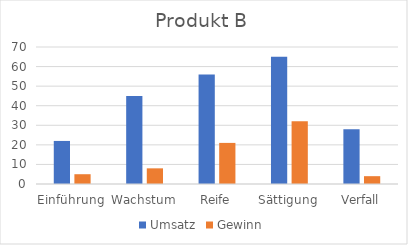
| Category | Umsatz | Gewinn |
|---|---|---|
| Einführung | 22 | 5 |
| Wachstum | 45 | 8 |
| Reife | 56 | 21 |
| Sättigung | 65 | 32 |
| Verfall | 28 | 4 |